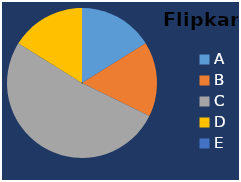
| Category | Shopclues |
|---|---|
| A | 250 |
| B | 250 |
| C | 800 |
| D | 250 |
| E | 0 |